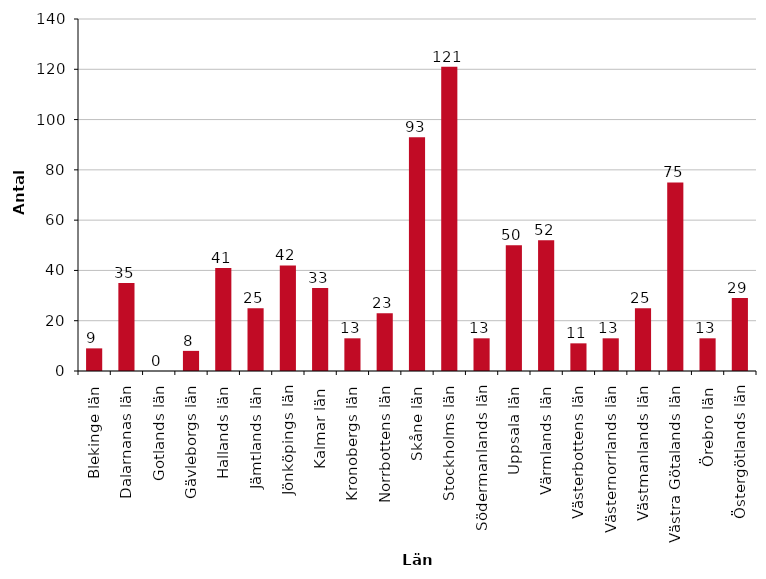
| Category | Antal klimatdeklarationer |
|---|---|
| Blekinge län | 9 |
| Dalarnanas län | 35 |
| Gotlands län | 0 |
| Gävleborgs län | 8 |
| Hallands län | 41 |
| Jämtlands län | 25 |
| Jönköpings län | 42 |
| Kalmar län | 33 |
| Kronobergs län | 13 |
| Norrbottens län | 23 |
| Skåne län | 93 |
| Stockholms län | 121 |
| Södermanlands län | 13 |
| Uppsala län | 50 |
| Värmlands län | 52 |
| Västerbottens län | 11 |
| Västernorrlands län | 13 |
| Västmanlands län | 25 |
| Västra Götalands län | 75 |
| Örebro län | 13 |
| Östergötlands län | 29 |